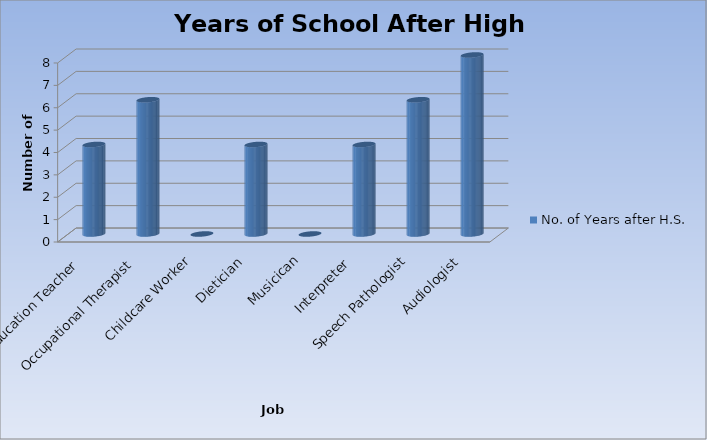
| Category | No. of Years after H.S. |
|---|---|
| Special Education Teacher | 4 |
| Occupational Therapist | 6 |
| Childcare Worker | 0 |
| Dietician | 4 |
| Musicican | 0 |
| Interpreter | 4 |
| Speech Pathologist | 6 |
| Audiologist | 8 |